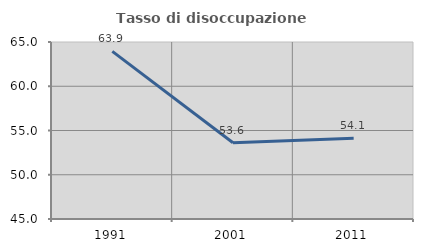
| Category | Tasso di disoccupazione giovanile  |
|---|---|
| 1991.0 | 63.946 |
| 2001.0 | 53.623 |
| 2011.0 | 54.128 |